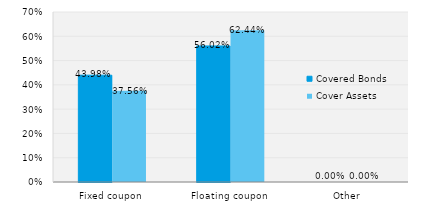
| Category | Covered Bonds | Cover Assets |
|---|---|---|
| Fixed coupon | 0.44 | 0.376 |
| Floating coupon | 0.56 | 0.624 |
| Other | 0 | 0 |